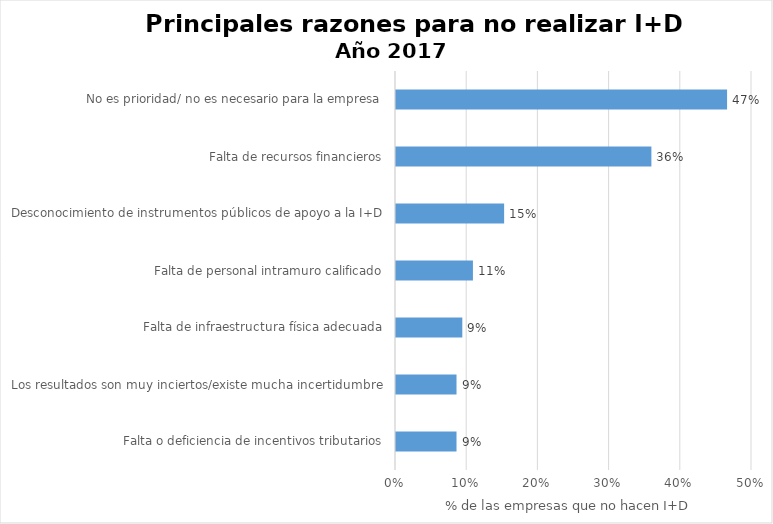
| Category | Series 0 |
|---|---|
| Falta o deficiencia de incentivos tributarios | 0.085 |
| Los resultados son muy inciertos/existe mucha incertidumbre | 0.085 |
| Falta de infraestructura física adecuada | 0.093 |
| Falta de personal intramuro calificado | 0.108 |
| Desconocimiento de instrumentos públicos de apoyo a la I+D | 0.152 |
| Falta de recursos financieros | 0.359 |
| No es prioridad/ no es necesario para la empresa | 0.465 |